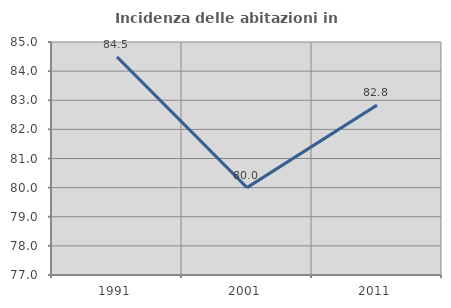
| Category | Incidenza delle abitazioni in proprietà  |
|---|---|
| 1991.0 | 84.49 |
| 2001.0 | 80 |
| 2011.0 | 82.833 |